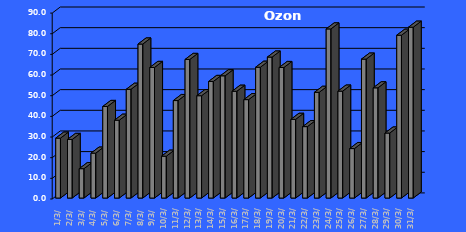
| Category | Ozon  [µg/m3] |
|---|---|
| 2023-03-01 | 29.002 |
| 2023-03-02 | 28.377 |
| 2023-03-03 | 14.22 |
| 2023-03-04 | 21.74 |
| 2023-03-05 | 44.33 |
| 2023-03-06 | 37.676 |
| 2023-03-07 | 52.659 |
| 2023-03-08 | 74.554 |
| 2023-03-09 | 63.223 |
| 2023-03-10 | 20.257 |
| 2023-03-11 | 47.198 |
| 2023-03-12 | 67.097 |
| 2023-03-13 | 49.536 |
| 2023-03-14 | 56.44 |
| 2023-03-15 | 59.182 |
| 2023-03-16 | 51.703 |
| 2023-03-17 | 47.645 |
| 2023-03-18 | 63.323 |
| 2023-03-19 | 68.243 |
| 2023-03-20 | 63.195 |
| 2023-03-21 | 38.104 |
| 2023-03-22 | 34.576 |
| 2023-03-23 | 51.176 |
| 2023-03-24 | 81.877 |
| 2023-03-25 | 51.766 |
| 2023-03-26 | 23.951 |
| 2023-03-27 | 67.261 |
| 2023-03-28 | 53.358 |
| 2023-03-29 | 31.465 |
| 2023-03-30 | 78.824 |
| 2023-03-31 | 82.707 |